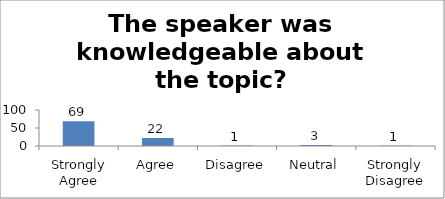
| Category | The speaker was knowledgeable about the topic? |
|---|---|
| Strongly Agree | 69 |
| Agree | 22 |
| Disagree | 1 |
| Neutral | 3 |
| Strongly Disagree | 1 |